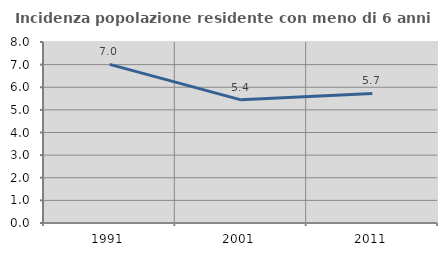
| Category | Incidenza popolazione residente con meno di 6 anni |
|---|---|
| 1991.0 | 7.01 |
| 2001.0 | 5.442 |
| 2011.0 | 5.726 |